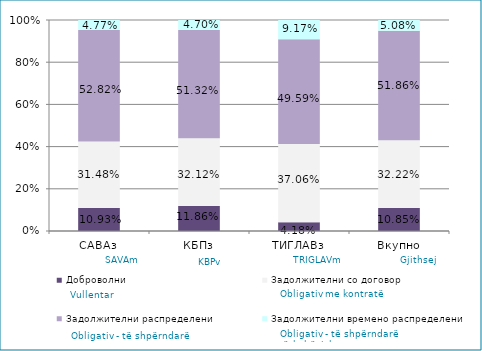
| Category | Доброволни  | Задолжителни со договор  | Задолжителни распределени  | Задолжителни времено распределени  |
|---|---|---|---|---|
| САВАз | 0.109 | 0.315 | 0.528 | 0.048 |
| КБПз | 0.119 | 0.321 | 0.513 | 0.047 |
| ТИГЛАВз | 0.042 | 0.371 | 0.496 | 0.092 |
| Вкупно | 0.108 | 0.322 | 0.519 | 0.051 |